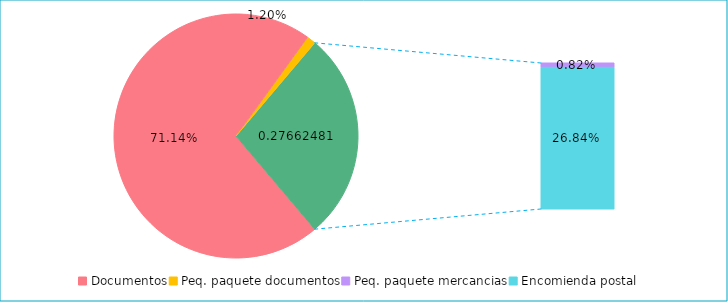
| Category | Series 0 |
|---|---|
| Documentos | 0.711 |
| Peq. paquete documentos | 0.012 |
| Peq. paquete mercancias | 0.008 |
| Encomienda postal | 0.268 |